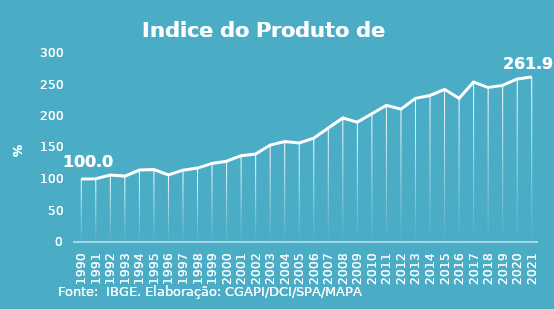
| Category | Indice de Prod. base 1990 |
|---|---|
| 1990.0 | 100 |
| 1991.0 | 100.275 |
| 1992.0 | 106.203 |
| 1993.0 | 104.57 |
| 1994.0 | 114.164 |
| 1995.0 | 115.024 |
| 1996.0 | 106.552 |
| 1997.0 | 114.037 |
| 1998.0 | 117.319 |
| 1999.0 | 124.734 |
| 2000.0 | 128.293 |
| 2001.0 | 136.975 |
| 2002.0 | 139.51 |
| 2003.0 | 153.868 |
| 2004.0 | 159.641 |
| 2005.0 | 157.136 |
| 2006.0 | 164.858 |
| 2007.0 | 180.781 |
| 2008.0 | 196.91 |
| 2009.0 | 190.309 |
| 2010.0 | 203.581 |
| 2011.0 | 217.041 |
| 2012.0 | 210.932 |
| 2013.0 | 228.009 |
| 2014.0 | 232.562 |
| 2015.0 | 242.318 |
| 2016.0 | 228.239 |
| 2017.0 | 253.826 |
| 2018.0 | 245.134 |
| 2019.0 | 248.619 |
| 2020.0 | 258.848 |
| 2021.0 | 261.923 |